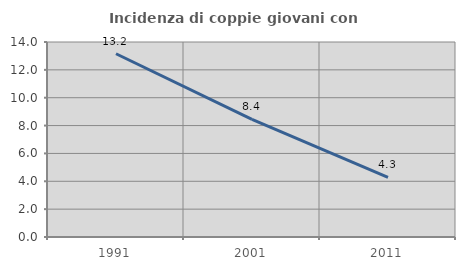
| Category | Incidenza di coppie giovani con figli |
|---|---|
| 1991.0 | 13.158 |
| 2001.0 | 8.447 |
| 2011.0 | 4.273 |